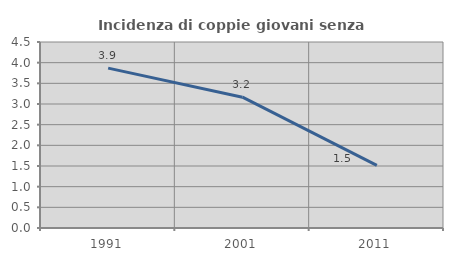
| Category | Incidenza di coppie giovani senza figli |
|---|---|
| 1991.0 | 3.867 |
| 2001.0 | 3.165 |
| 2011.0 | 1.515 |